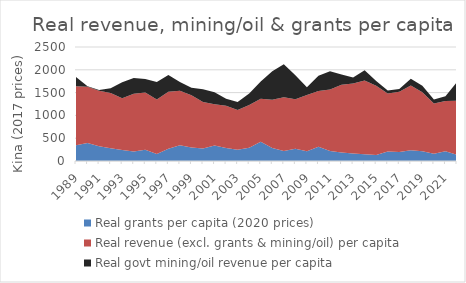
| Category | Real grants per capita (2020 prices) | Real revenue (excl. grants & mining/oil) per capita | Real govt mining/oil revenue per capita |
|---|---|---|---|
| 1989.0 | 344.657 | 1294.509 | 202.943 |
| 1990.0 | 396.757 | 1234.226 | 9.289 |
| 1991.0 | 325.35 | 1217.638 | 11.36 |
| 1992.0 | 278.52 | 1211.13 | 107.265 |
| 1993.0 | 239.858 | 1137.477 | 351.202 |
| 1994.0 | 206.759 | 1266.399 | 348.153 |
| 1995.0 | 247.282 | 1256.887 | 294.399 |
| 1996.0 | 155.378 | 1190.592 | 387.486 |
| 1997.0 | 267.521 | 1248.688 | 371.7 |
| 1998.0 | 346.414 | 1196.06 | 190.627 |
| 1999.0 | 298.577 | 1142.802 | 166.342 |
| 2000.0 | 273.286 | 1018.208 | 283.341 |
| 2001.0 | 340.761 | 905.552 | 263.082 |
| 2002.0 | 287.146 | 926.227 | 151.506 |
| 2003.0 | 245.856 | 872.31 | 176.782 |
| 2004.0 | 289.114 | 940.564 | 250.291 |
| 2005.0 | 419.478 | 946.057 | 375.932 |
| 2006.0 | 285.405 | 1059.236 | 624.919 |
| 2007.0 | 217.667 | 1182.558 | 721.683 |
| 2008.0 | 266.452 | 1089.768 | 524.714 |
| 2009.0 | 213.107 | 1233.885 | 168.324 |
| 2010.0 | 314.152 | 1222.078 | 333.393 |
| 2011.0 | 216.837 | 1348.979 | 402.619 |
| 2012.0 | 184.443 | 1487.574 | 223.539 |
| 2013.0 | 163.283 | 1538.839 | 127.519 |
| 2014.0 | 150.354 | 1612.953 | 229.439 |
| 2015.0 | 131.333 | 1516.285 | 109.394 |
| 2016.0 | 210.538 | 1271.43 | 61.7 |
| 2017.0 | 197.158 | 1323.608 | 57.303 |
| 2018.0 | 235.375 | 1419.16 | 151.467 |
| 2019.0 | 213.854 | 1293.195 | 140.639 |
| 2020.0 | 159.189 | 1104.413 | 87.358 |
| 2021.0 | 214.321 | 1101.051 | 107.314 |
| 2022.0 | 137.361 | 1184.972 | 407.454 |